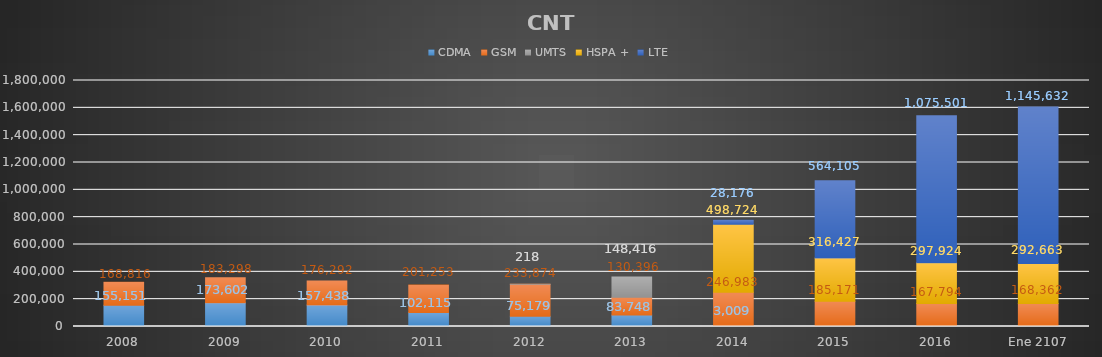
| Category | CDMA | GSM | UMTS | HSPA + | LTE |
|---|---|---|---|---|---|
| 2008 | 155151 | 168816 | 0 | 0 | 0 |
| 2009 | 173602 | 183298 | 0 | 0 | 0 |
| 2010 | 157438 | 176292 | 0 | 0 | 0 |
| 2011 | 102115 | 201253 | 0 | 0 | 0 |
| 2012 | 75179 | 233874 | 218 | 0 | 0 |
| 2013 | 83748 | 130396 | 148416 | 0 | 0 |
| 2014 | 3009 | 246983 | 0 | 498724 | 28176 |
| 2015 | 0 | 185171 | 0 | 316427 | 564105 |
| 2016 | 0 | 167794 | 0 | 297924 | 1075501 |
| Ene 2107 | 0 | 168362 | 0 | 292663 | 1145632 |